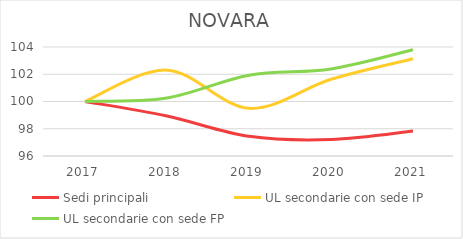
| Category | Sedi principali | UL secondarie con sede IP | UL secondarie con sede FP |
|---|---|---|---|
| 2017.0 | 100 | 100 | 100 |
| 2018.0 | 98.935 | 102.302 | 100.262 |
| 2019.0 | 97.446 | 99.498 | 101.93 |
| 2020.0 | 97.21 | 101.632 | 102.388 |
| 2021.0 | 97.828 | 103.139 | 103.795 |